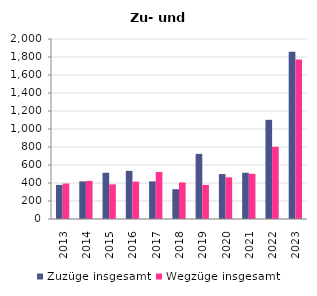
| Category | Zuzüge insgesamt | Wegzüge insgesamt |
|---|---|---|
| 2013.0 | 379 | 394 |
| 2014.0 | 418 | 424 |
| 2015.0 | 514 | 385 |
| 2016.0 | 535 | 415 |
| 2017.0 | 418 | 523 |
| 2018.0 | 331 | 406 |
| 2019.0 | 724 | 379 |
| 2020.0 | 499 | 463 |
| 2021.0 | 514 | 502 |
| 2022.0 | 1102 | 802 |
| 2023.0 | 1858 | 1771 |